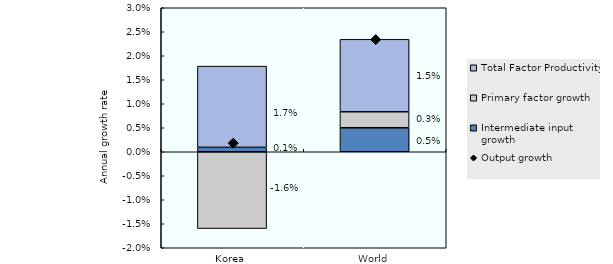
| Category | Intermediate input growth | Primary factor growth | Total Factor Productivity |
|---|---|---|---|
| Korea | 0.001 | -0.016 | 0.017 |
| World | 0.005 | 0.003 | 0.015 |